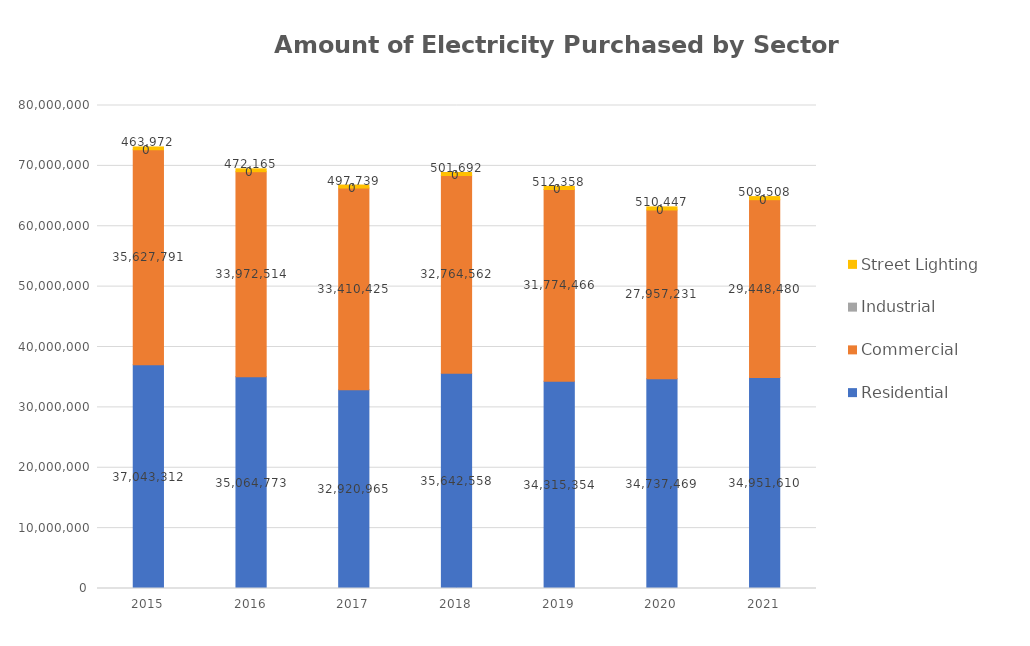
| Category | Residential  | Commercial  | Industrial  | Street Lighting  |
|---|---|---|---|---|
| 2015 | 37043312 | 35627791 | 0 | 463972 |
| 2016 | 35064773 | 33972514 | 0 | 472165 |
| 2017 | 32920965 | 33410425 | 0 | 497739 |
| 2018 | 35642558 | 32764562 | 0 | 501692 |
| 2019 | 34315354 | 31774466 | 0 | 512358 |
| 2020 | 34737469 | 27957231 | 0 | 510447 |
| 2021 | 34951610 | 29448480 | 0 | 509508 |